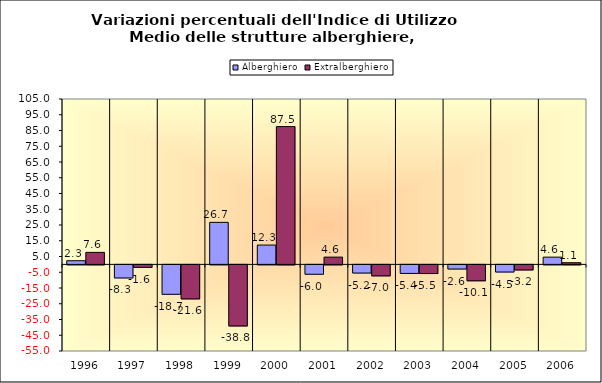
| Category | Alberghiero | Extralberghiero |
|---|---|---|
| 1996.0 | 2.32 | 7.627 |
| 1997.0 | -8.312 | -1.575 |
| 1998.0 | -18.681 | -21.6 |
| 1999.0 | 26.689 | -38.776 |
| 2000.0 | 12.267 | 87.5 |
| 2001.0 | -5.956 | 4.608 |
| 2002.0 | -5.193 | -6.976 |
| 2003.0 | -5.426 | -5.505 |
| 2004.0 | -2.643 | -10.1 |
| 2005.0 | -4.536 | -3.226 |
| 2006.0 | 4.603 | 1.056 |